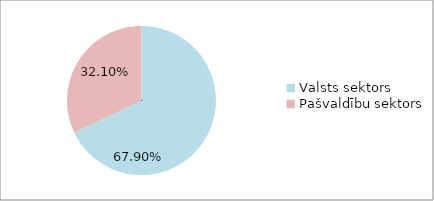
| Category | Series 0 |
|---|---|
| Valsts sektors | 0.679 |
| Pašvaldību sektors | 0.321 |